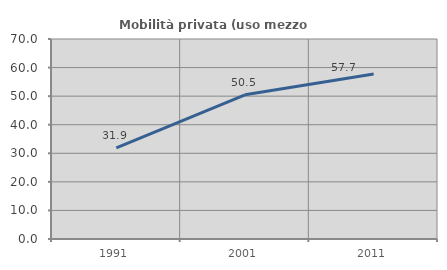
| Category | Mobilità privata (uso mezzo privato) |
|---|---|
| 1991.0 | 31.895 |
| 2001.0 | 50.481 |
| 2011.0 | 57.745 |